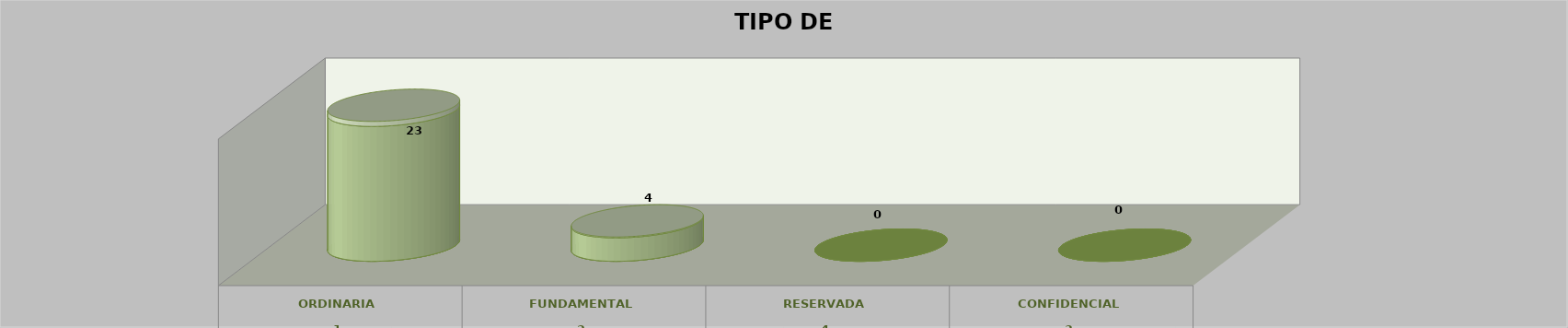
| Category | Series 0 | Series 1 | Series 2 | Series 3 | Series 4 |
|---|---|---|---|---|---|
| 0 |  |  |  | 23 | 0.852 |
| 1 |  |  |  | 4 | 0.148 |
| 2 |  |  |  | 0 | 0 |
| 3 |  |  |  | 0 | 0 |